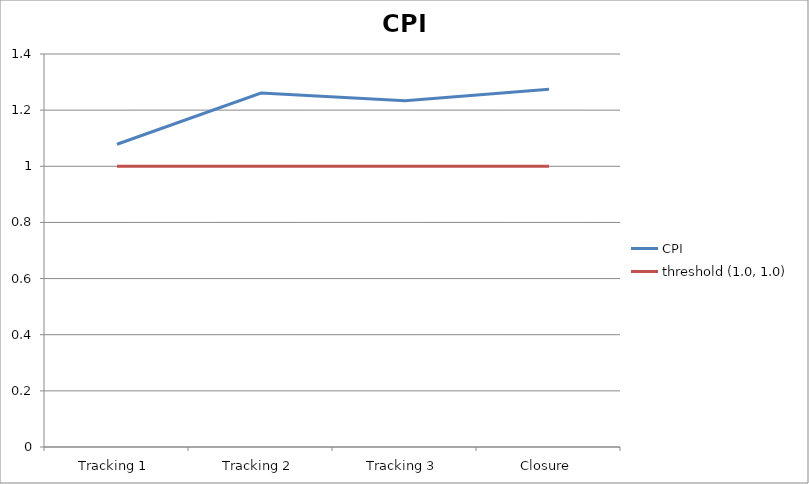
| Category | CPI | threshold (1.0, 1.0) |
|---|---|---|
| Tracking 1 | 1.078 | 1 |
| Tracking 2 | 1.261 | 1 |
| Tracking 3 | 1.234 | 1 |
| Closure | 1.275 | 1 |